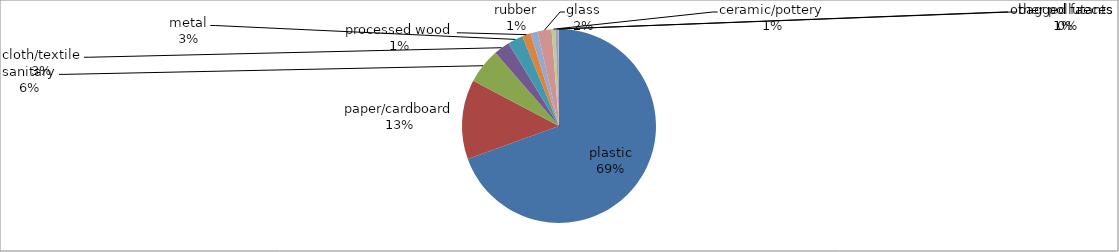
| Category | Share |
|---|---|
| plastic | 0.695 |
| paper/cardboard | 0.133 |
| sanitary | 0.059 |
| cloth/textile | 0.027 |
| metal | 0.026 |
| processed wood | 0.014 |
| rubber | 0.012 |
| glass | 0.023 |
| ceramic/pottery | 0.006 |
| other pollutants | 0.005 |
| bagged faeces | 0.001 |